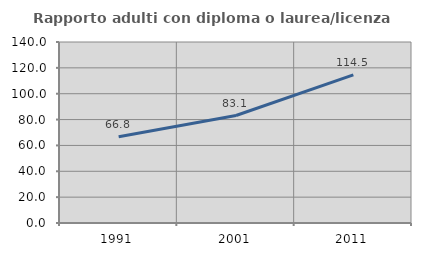
| Category | Rapporto adulti con diploma o laurea/licenza media  |
|---|---|
| 1991.0 | 66.791 |
| 2001.0 | 83.146 |
| 2011.0 | 114.543 |